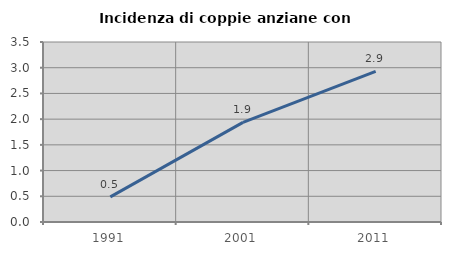
| Category | Incidenza di coppie anziane con figli |
|---|---|
| 1991.0 | 0.488 |
| 2001.0 | 1.938 |
| 2011.0 | 2.929 |